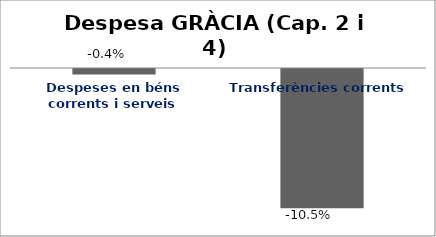
| Category | Series 0 |
|---|---|
| Despeses en béns corrents i serveis | -0.004 |
| Transferències corrents | -0.105 |